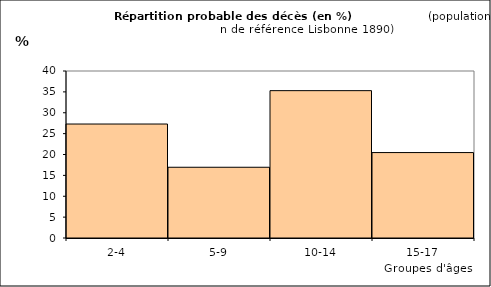
| Category | Series 0 |
|---|---|
| 2-4 | 27.298 |
| 5-9 | 16.945 |
| 10-14 | 35.293 |
| 15-17 | 20.464 |